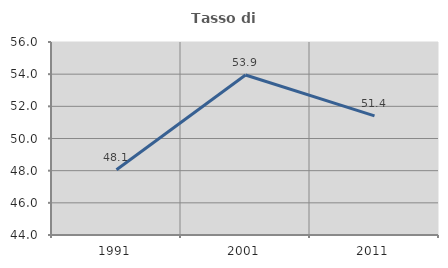
| Category | Tasso di occupazione   |
|---|---|
| 1991.0 | 48.061 |
| 2001.0 | 53.946 |
| 2011.0 | 51.403 |